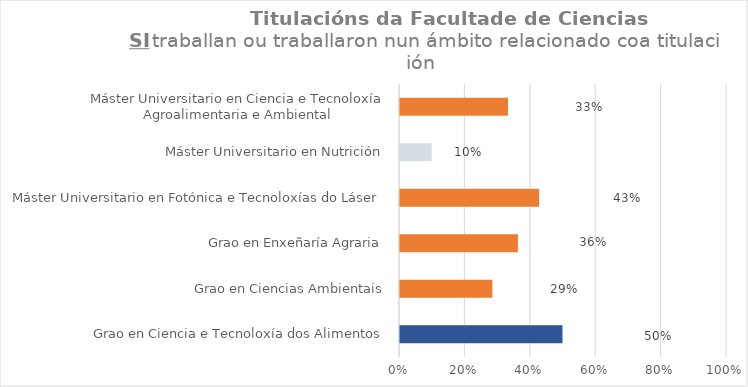
| Category | Series 0 |
|---|---|
| Grao en Ciencia e Tecnoloxía dos Alimentos | 0.5 |
| Grao en Ciencias Ambientais | 0.286 |
| Grao en Enxeñaría Agraria | 0.364 |
| Máster Universitario en Fotónica e Tecnoloxías do Láser | 0.429 |
| Máster Universitario en Nutrición | 0.1 |
| Máster Universitario en Ciencia e Tecnoloxía Agroalimentaria e Ambiental | 0.333 |